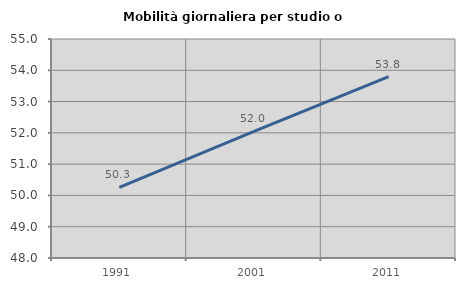
| Category | Mobilità giornaliera per studio o lavoro |
|---|---|
| 1991.0 | 50.257 |
| 2001.0 | 52.049 |
| 2011.0 | 53.799 |